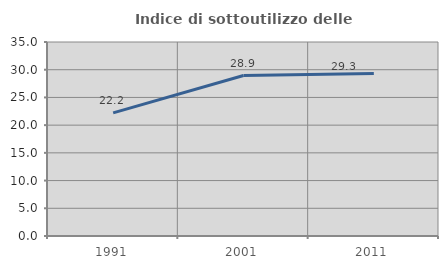
| Category | Indice di sottoutilizzo delle abitazioni  |
|---|---|
| 1991.0 | 22.222 |
| 2001.0 | 28.947 |
| 2011.0 | 29.31 |